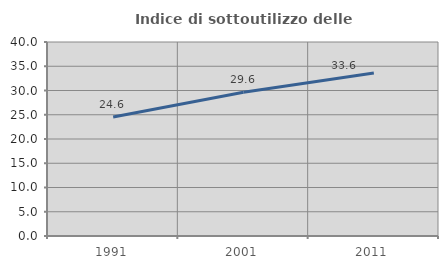
| Category | Indice di sottoutilizzo delle abitazioni  |
|---|---|
| 1991.0 | 24.555 |
| 2001.0 | 29.65 |
| 2011.0 | 33.617 |